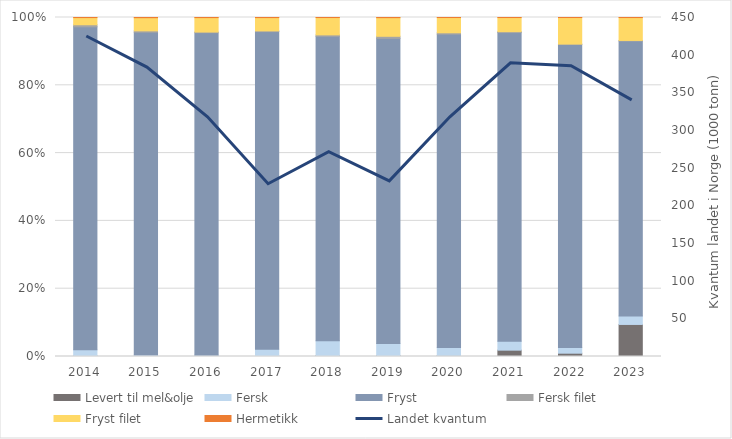
| Category | Levert til mel&olje | Fersk | Fryst | Fersk filet | Fryst filet | Hermetikk |
|---|---|---|---|---|---|---|
| 2014.0 | 0.563 | 7.392 | 386.409 | 2.446 | 8.595 | 0.096 |
| 2015.0 | 0.257 | 1.213 | 344.359 | 1.436 | 14.054 | 0.19 |
| 2016.0 | 0.157 | 1.118 | 301.785 | 0.601 | 13.49 | 0.103 |
| 2017.0 | 0.412 | 6.878 | 323.308 | 0.755 | 13.489 | 0.103 |
| 2018.0 | 0.726 | 11.575 | 237.24 | 1.086 | 13.493 | 0.04 |
| 2019.0 | 0.712 | 8.703 | 223.178 | 1.515 | 13.632 | 0.108 |
| 2020.0 | 0.983 | 7.317 | 285.533 | 1.236 | 13.897 | 0.032 |
| 2021.0 | 7.613 | 10.686 | 370.439 | 1.134 | 16.87 | 0.065 |
| 2022.0 | 3.512 | 6.054 | 322.412 | 0.489 | 28.218 | 0.044 |
| 2023.0 | 33.543 | 8.868 | 287.722 | 0.595 | 23.95 | 0.074 |